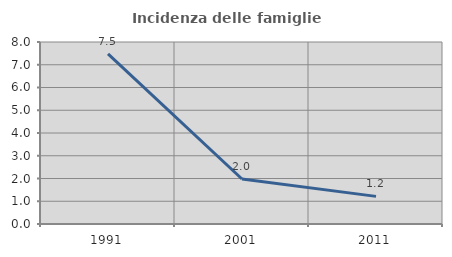
| Category | Incidenza delle famiglie numerose |
|---|---|
| 1991.0 | 7.48 |
| 2001.0 | 1.978 |
| 2011.0 | 1.215 |